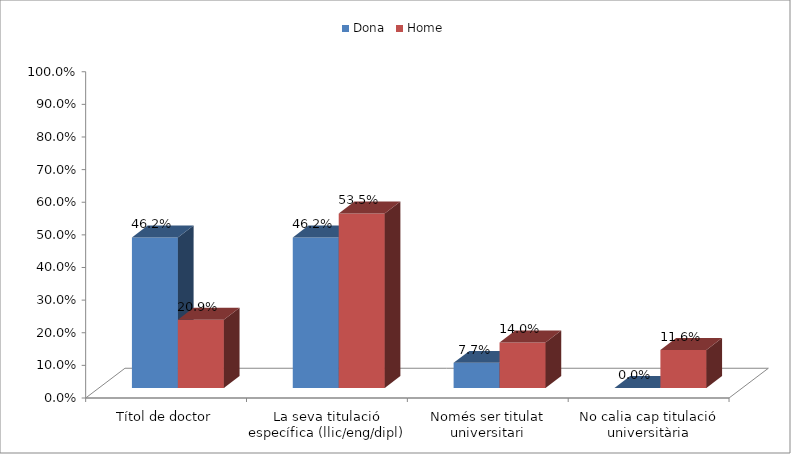
| Category | Dona | Home |
|---|---|---|
| Títol de doctor | 0.462 | 0.209 |
| La seva titulació específica (llic/eng/dipl) | 0.462 | 0.535 |
| Només ser titulat universitari | 0.077 | 0.14 |
| No calia cap titulació universitària | 0 | 0.116 |